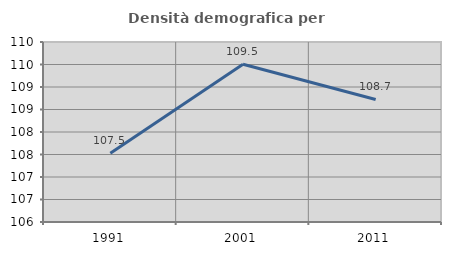
| Category | Densità demografica |
|---|---|
| 1991.0 | 107.529 |
| 2001.0 | 109.505 |
| 2011.0 | 108.723 |